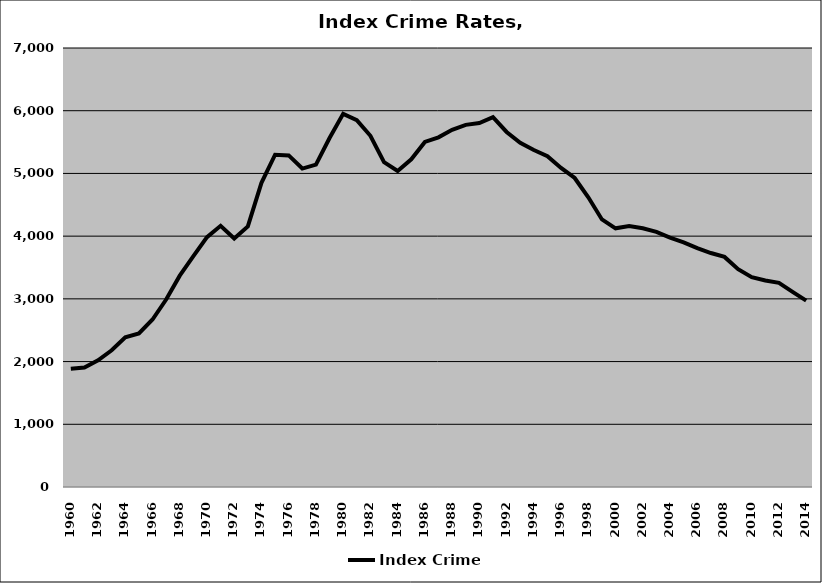
| Category | Index Crime |
|---|---|
| 1960.0 | 1887.185 |
| 1961.0 | 1906.089 |
| 1962.0 | 2019.804 |
| 1963.0 | 2180.287 |
| 1964.0 | 2388.09 |
| 1965.0 | 2448.968 |
| 1966.0 | 2670.819 |
| 1967.0 | 2989.729 |
| 1968.0 | 3370.233 |
| 1969.0 | 3679.951 |
| 1970.0 | 3984.554 |
| 1971.0 | 4164.743 |
| 1972.0 | 3961.389 |
| 1973.0 | 4154.429 |
| 1974.0 | 4850.43 |
| 1975.0 | 5298.521 |
| 1976.0 | 5287.316 |
| 1977.0 | 5077.649 |
| 1978.0 | 5140.334 |
| 1979.0 | 5565.464 |
| 1980.0 | 5949.973 |
| 1981.0 | 5849.994 |
| 1982.0 | 5600.51 |
| 1983.0 | 5179.232 |
| 1984.0 | 5038.38 |
| 1985.0 | 5224.512 |
| 1986.0 | 5501.899 |
| 1987.0 | 5575.454 |
| 1988.0 | 5694.537 |
| 1989.0 | 5774.043 |
| 1990.0 | 5802.677 |
| 1991.0 | 5898.354 |
| 1992.0 | 5661.376 |
| 1993.0 | 5487.102 |
| 1994.0 | 5373.834 |
| 1995.0 | 5274.945 |
| 1996.0 | 5087.636 |
| 1997.0 | 4927.326 |
| 1998.0 | 4620.095 |
| 1999.0 | 4266.509 |
| 2000.0 | 4124.793 |
| 2001.0 | 4162.614 |
| 2002.0 | 4125.01 |
| 2003.0 | 4067.052 |
| 2004.0 | 3977.252 |
| 2005.0 | 3900.581 |
| 2006.0 | 3808.173 |
| 2007.0 | 3730.447 |
| 2008.0 | 3669.087 |
| 2009.0 | 3473.201 |
| 2010.0 | 3345.517 |
| 2011.0 | 3292.418 |
| 2012.0 | 3255.787 |
| 2013.0 | 3112.329 |
| 2014.0 | 2971.807 |